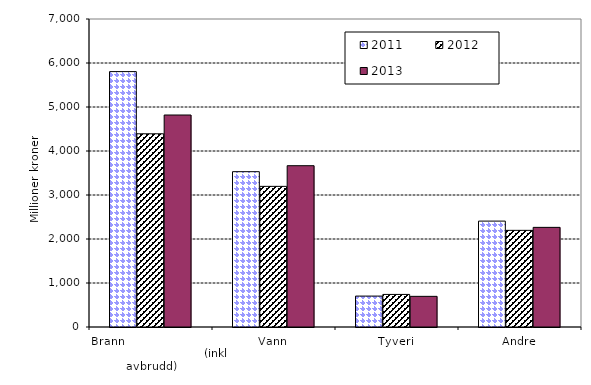
| Category | 2011 | 2012 | 2013 |
|---|---|---|---|
| Brann                                                       (inkl avbrudd) | 5804.363 | 4391.184 | 4817.943 |
| Vann | 3530.035 | 3196.153 | 3665.899 |
| Tyveri | 702.703 | 740.391 | 696.534 |
| Andre | 2406.919 | 2196.642 | 2264.482 |